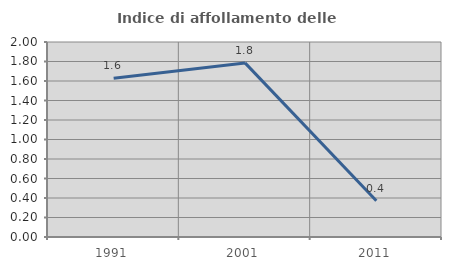
| Category | Indice di affollamento delle abitazioni  |
|---|---|
| 1991.0 | 1.627 |
| 2001.0 | 1.786 |
| 2011.0 | 0.371 |